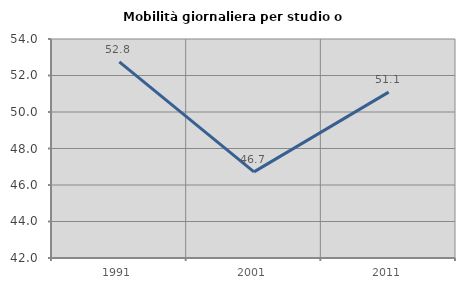
| Category | Mobilità giornaliera per studio o lavoro |
|---|---|
| 1991.0 | 52.75 |
| 2001.0 | 46.719 |
| 2011.0 | 51.087 |